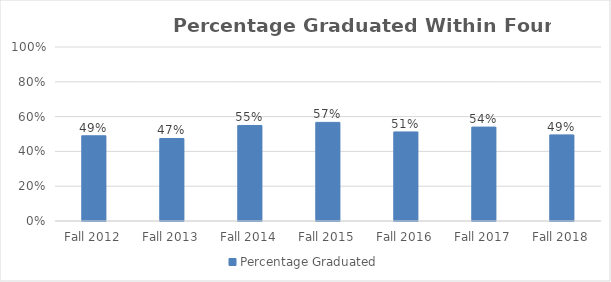
| Category | Percentage Graduated |
|---|---|
| Fall 2012 | 0.49 |
| Fall 2013 | 0.474 |
| Fall 2014 | 0.549 |
| Fall 2015 | 0.567 |
| Fall 2016 | 0.512 |
| Fall 2017 | 0.54 |
| Fall 2018 | 0.495 |